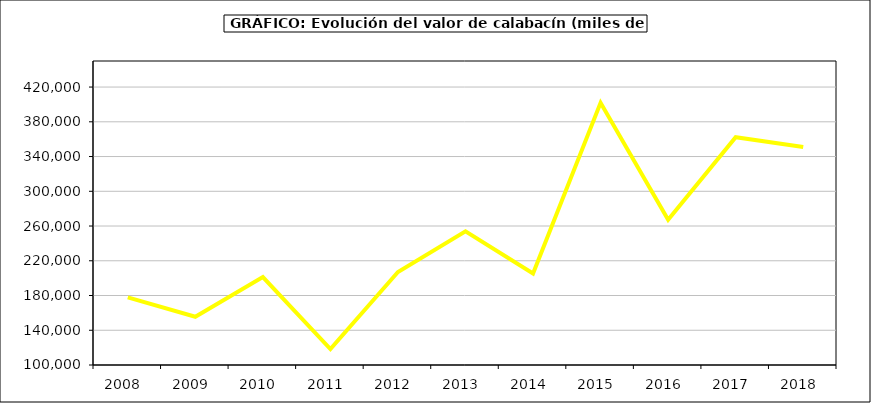
| Category | Valor |
|---|---|
| 2008.0 | 177885.879 |
| 2009.0 | 155520.785 |
| 2010.0 | 201170.752 |
| 2011.0 | 118311.354 |
| 2012.0 | 207035.363 |
| 2013.0 | 253994.073 |
| 2014.0 | 205307.232 |
| 2015.0 | 401801.34 |
| 2016.0 | 267259 |
| 2017.0 | 362286.358 |
| 2018.0 | 351050.64 |